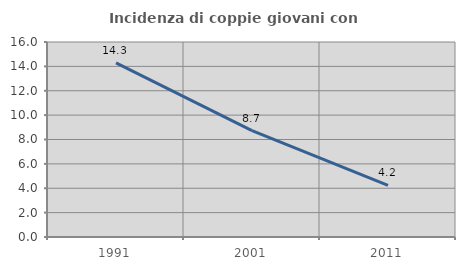
| Category | Incidenza di coppie giovani con figli |
|---|---|
| 1991.0 | 14.288 |
| 2001.0 | 8.734 |
| 2011.0 | 4.229 |